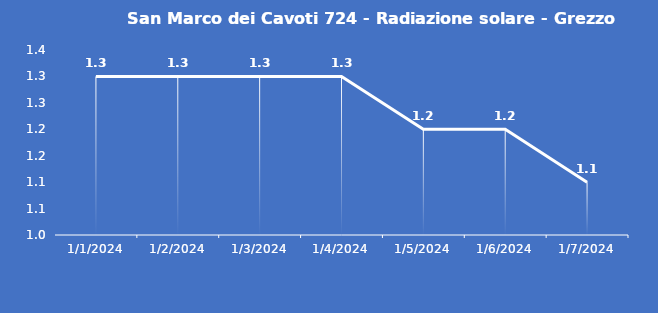
| Category | San Marco dei Cavoti 724 - Radiazione solare - Grezzo (W/m2) |
|---|---|
| 1/1/24 | 1.3 |
| 1/2/24 | 1.3 |
| 1/3/24 | 1.3 |
| 1/4/24 | 1.3 |
| 1/5/24 | 1.2 |
| 1/6/24 | 1.2 |
| 1/7/24 | 1.1 |